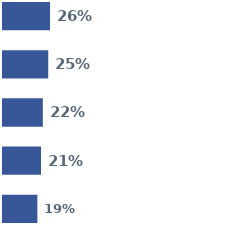
| Category | Series 0 | Series 1 | Series 2 | Series 3 | Series 4 |
|---|---|---|---|---|---|
| 0 | 0.26 | 0.25 | 0.22 | 0.21 | 0.19 |